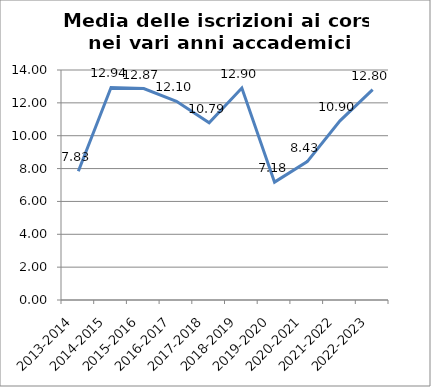
| Category | Media delle iscrizioni ai Corsi |
|---|---|
| 2013-2014 | 7.833 |
| 2014-2015 | 12.935 |
| 2015-2016 | 12.87 |
| 2016-2017 | 12.098 |
| 2017-2018 | 10.787 |
| 2018-2019 | 12.905 |
| 2019-2020 | 7.175 |
| 2020-2021 | 8.426 |
| 2021-2022 | 10.903 |
| 2022-2023 | 12.802 |